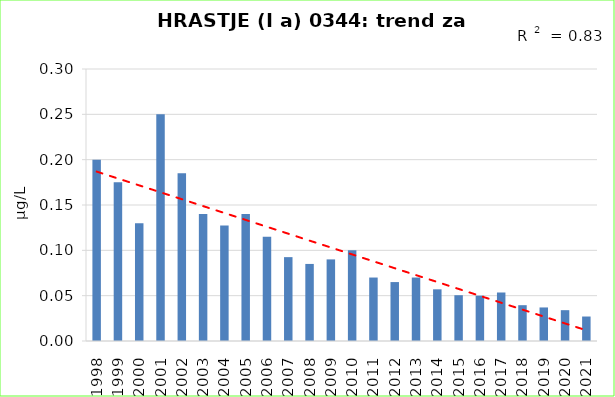
| Category | Vsota |
|---|---|
| 1998 | 0.2 |
| 1999 | 0.175 |
| 2000 | 0.13 |
| 2001 | 0.25 |
| 2002 | 0.185 |
| 2003 | 0.14 |
| 2004 | 0.128 |
| 2005 | 0.14 |
| 2006 | 0.115 |
| 2007 | 0.092 |
| 2008 | 0.085 |
| 2009 | 0.09 |
| 2010 | 0.1 |
| 2011 | 0.07 |
| 2012 | 0.065 |
| 2013 | 0.07 |
| 2014 | 0.057 |
| 2015 | 0.05 |
| 2016 | 0.05 |
| 2017 | 0.054 |
| 2018 | 0.04 |
| 2019 | 0.037 |
| 2020 | 0.034 |
| 2021 | 0.027 |